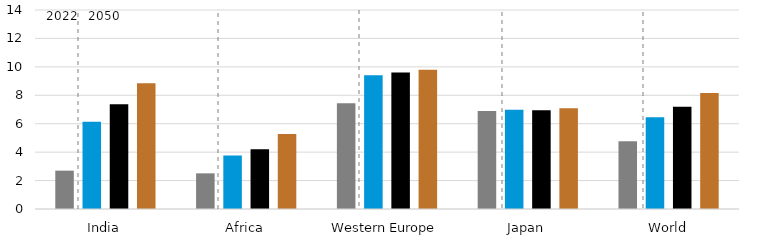
| Category | Series 0 | Series 1 | Series 2 | Series 3 |
|---|---|---|---|---|
| India | 2.697 | 6.144 | 7.37 | 8.85 |
| Africa | 2.509 | 3.769 | 4.2 | 5.279 |
| Western Europe | 7.434 | 9.403 | 9.598 | 9.792 |
| Japan | 6.9 | 6.989 | 6.942 | 7.081 |
| World | 4.775 | 6.454 | 7.192 | 8.156 |